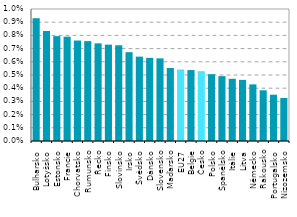
| Category | Series 0 |
|---|---|
| Bulharsko | 0.009 |
| Lotyšsko | 0.008 |
| Estonsko | 0.008 |
| Francie | 0.008 |
| Chorvatsko | 0.008 |
| Rumunsko | 0.008 |
| Řecko | 0.007 |
| Finsko | 0.007 |
| Slovinsko | 0.007 |
| Irsko | 0.007 |
| Švédsko | 0.006 |
| Dánsko | 0.006 |
| Slovensko | 0.006 |
| Maďarsko | 0.006 |
| EU27 | 0.005 |
| Belgie | 0.005 |
| Česko | 0.005 |
| Polsko | 0.005 |
| Španělsko | 0.005 |
| Itálie | 0.005 |
| Litva | 0.005 |
| Německo | 0.004 |
| Rakousko | 0.004 |
| Portugalsko | 0.004 |
| Nizozemsko | 0.003 |